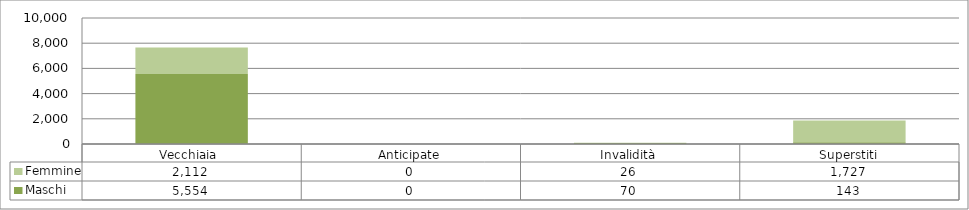
| Category | Maschi | Femmine |
|---|---|---|
| Vecchiaia  | 5554 | 2112 |
| Anticipate | 0 | 0 |
| Invalidità | 70 | 26 |
| Superstiti | 143 | 1727 |